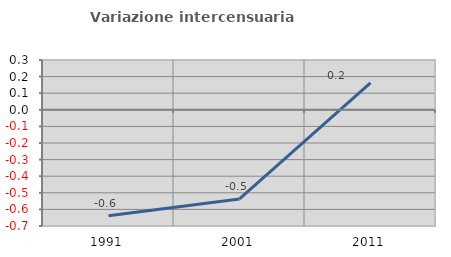
| Category | Variazione intercensuaria annua |
|---|---|
| 1991.0 | -0.639 |
| 2001.0 | -0.537 |
| 2011.0 | 0.162 |